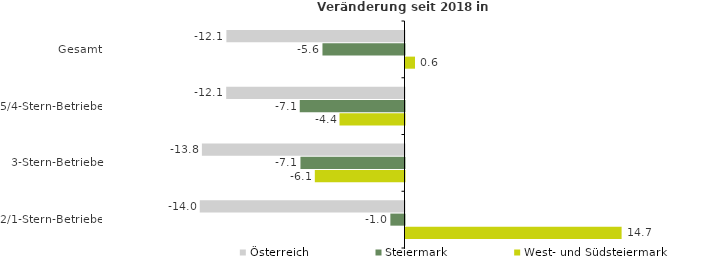
| Category | Österreich | Steiermark | West- und Südsteiermark |
|---|---|---|---|
| Gesamt | -12.137 | -5.59 | 0.648 |
| 5/4-Stern-Betriebe | -12.15 | -7.138 | -4.428 |
| 3-Stern-Betriebe | -13.805 | -7.09 | -6.111 |
| 2/1-Stern-Betriebe | -13.951 | -0.963 | 14.726 |